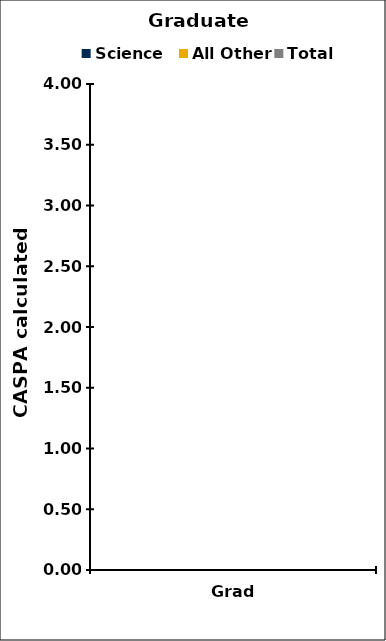
| Category | Science | All Other | Total |
|---|---|---|---|
| Grad | 0 | 0 | 0 |